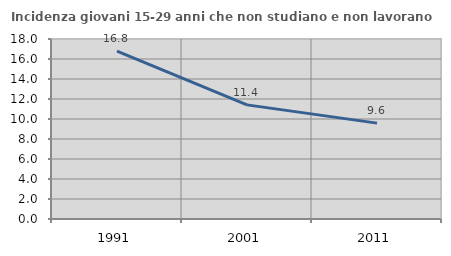
| Category | Incidenza giovani 15-29 anni che non studiano e non lavorano  |
|---|---|
| 1991.0 | 16.793 |
| 2001.0 | 11.412 |
| 2011.0 | 9.586 |